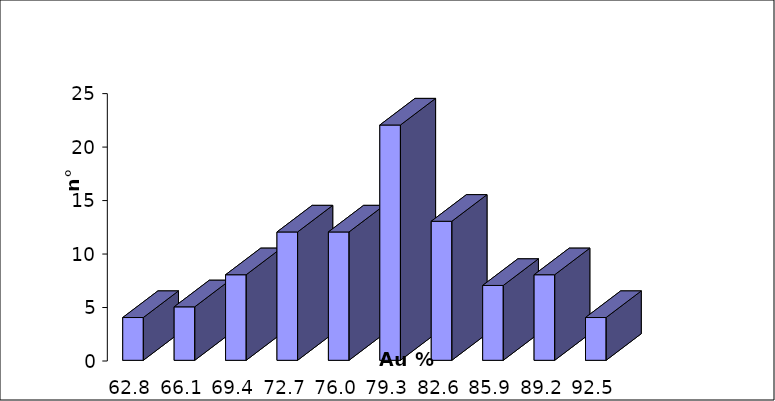
| Category | Series 0 |
|---|---|
| 62.845 | 4 |
| 66.135 | 5 |
| 69.425 | 8 |
| 72.715 | 12 |
| 76.005 | 12 |
| 79.295 | 22 |
| 82.585 | 13 |
| 85.875 | 7 |
| 89.16499999999995 | 8 |
| 92.45499999999994 | 4 |